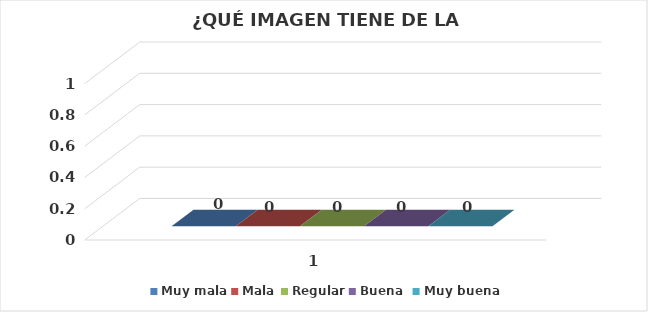
| Category | Muy mala | Mala | Regular | Buena  | Muy buena |
|---|---|---|---|---|---|
| 0 | 0 | 0 | 0 | 0 | 0 |